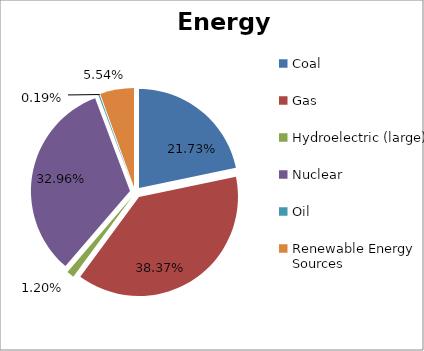
| Category | Energy Source |
|---|---|
| Coal | 0.217 |
| Gas | 0.384 |
| Hydroelectric (large) | 0.012 |
| Nuclear | 0.33 |
| Oil | 0.002 |
| Renewable Energy Sources | 0.055 |